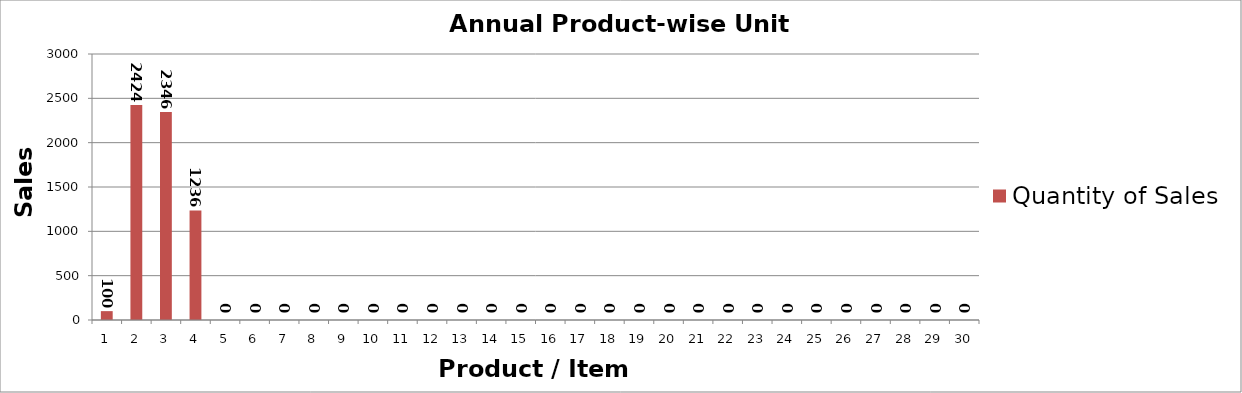
| Category | Quantity of Sales |
|---|---|
| 1.0 | 100 |
| 2.0 | 2424 |
| 3.0 | 2346 |
| 4.0 | 1236 |
| 5.0 | 0 |
| 6.0 | 0 |
| 7.0 | 0 |
| 8.0 | 0 |
| 9.0 | 0 |
| 10.0 | 0 |
| 11.0 | 0 |
| 12.0 | 0 |
| 13.0 | 0 |
| 14.0 | 0 |
| 15.0 | 0 |
| 16.0 | 0 |
| 17.0 | 0 |
| 18.0 | 0 |
| 19.0 | 0 |
| 20.0 | 0 |
| 21.0 | 0 |
| 22.0 | 0 |
| 23.0 | 0 |
| 24.0 | 0 |
| 25.0 | 0 |
| 26.0 | 0 |
| 27.0 | 0 |
| 28.0 | 0 |
| 29.0 | 0 |
| 30.0 | 0 |